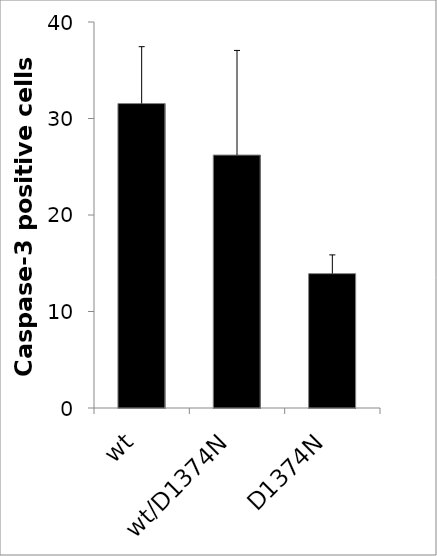
| Category | Caspase-3 positive cells |
|---|---|
| wt | 31.548 |
| wt/D1374N | 26.21 |
| D1374N | 13.924 |